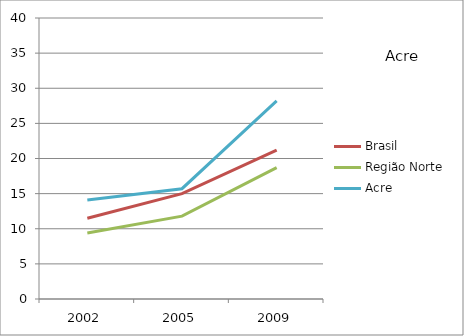
| Category | Brasil | Região Norte | Acre |
|---|---|---|---|
| 2002.0 | 11.5 | 9.4 | 14.1 |
| 2005.0 | 15 | 11.8 | 15.7 |
| 2009.0 | 21.2 | 18.7 | 28.2 |